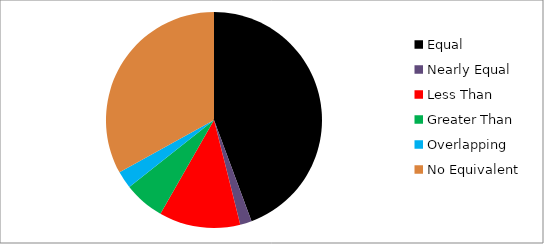
| Category | Series 0 |
|---|---|
| Equal | 51 |
| Nearly Equal | 2 |
| Less Than | 14 |
| Greater Than | 7 |
| Overlapping | 3 |
| No Equivalent | 38 |